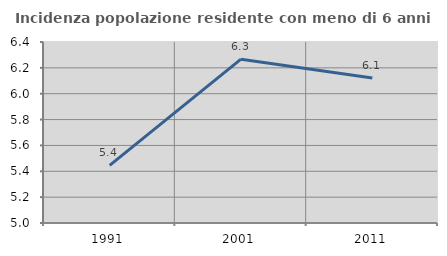
| Category | Incidenza popolazione residente con meno di 6 anni |
|---|---|
| 1991.0 | 5.446 |
| 2001.0 | 6.267 |
| 2011.0 | 6.121 |